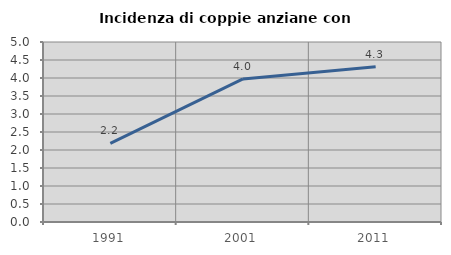
| Category | Incidenza di coppie anziane con figli |
|---|---|
| 1991.0 | 2.186 |
| 2001.0 | 3.974 |
| 2011.0 | 4.315 |